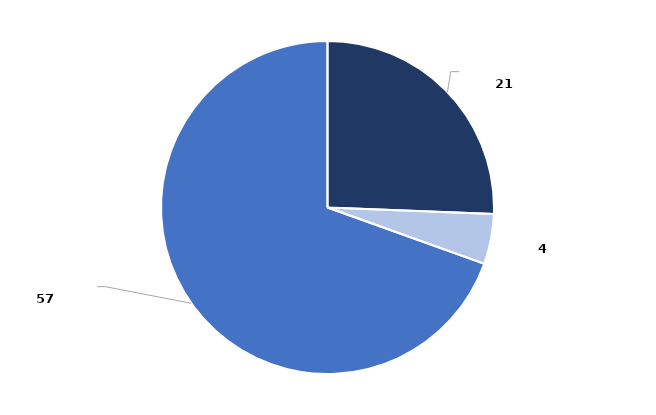
| Category | Series 0 |
|---|---|
| Criterio de Oportunidad | 0.256 |
| Conciliación | 0.049 |
| Suspensión Condicional del Procedimiento | 0.695 |